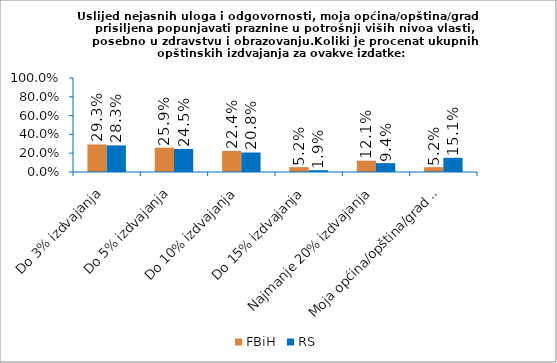
| Category | FBiH | RS |
|---|---|---|
| Do 3% izdvajanja | 0.293 | 0.283 |
| Do 5% izdvajanja | 0.259 | 0.245 |
| Do 10% izdvajanja | 0.224 | 0.208 |
| Do 15% izdvajanja | 0.052 | 0.019 |
| Najmanje 20% izdvajanja | 0.121 | 0.094 |
| Moja općina/opština/grad nema takvih izdvajanja | 0.052 | 0.151 |